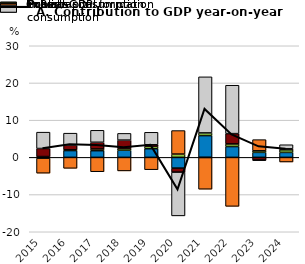
| Category | Private consumption | Public consumption | Gross capital formation | Imports (-) | Exports |
|---|---|---|---|---|---|
| 2015-01-01 | 0.218 | -0.215 | 2.158 | -4.036 | 4.397 |
| 2016-01-01 | 1.821 | 0.225 | 1.239 | -2.944 | 3.218 |
| 2017-01-01 | 1.794 | 0.459 | 1.798 | -3.863 | 3.224 |
| 2018-01-01 | 1.907 | 0.477 | 2.252 | -3.64 | 1.804 |
| 2019-01-01 | 2.321 | 0.642 | 0.418 | -3.315 | 3.356 |
| 2020-01-01 | -2.894 | 0.887 | -1.076 | 6.316 | -11.763 |
| 2021-01-01 | 5.847 | 0.726 | -0.043 | -8.516 | 15.072 |
| 2022-01-01 | 2.901 | 0.713 | 2.767 | -13.168 | 13.009 |
| 2023-01-01 | 1.339 | 0.422 | -0.727 | 3.002 | -0.114 |
| 2024-01-01 | 1.328 | 0.707 | 0.256 | -1.243 | 1.098 |